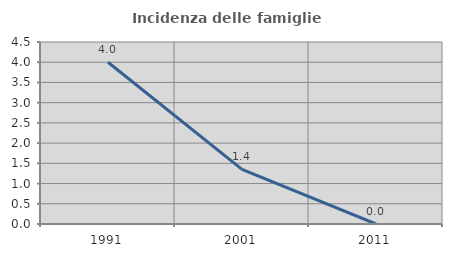
| Category | Incidenza delle famiglie numerose |
|---|---|
| 1991.0 | 4 |
| 2001.0 | 1.351 |
| 2011.0 | 0 |